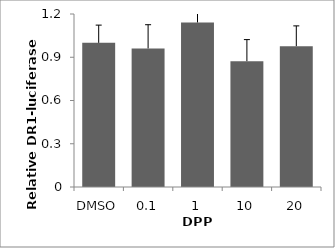
| Category | Series 0 |
|---|---|
| DMSO | 1 |
| 0.1 | 0.961 |
| 1 | 1.142 |
| 10 | 0.873 |
| 20 | 0.977 |